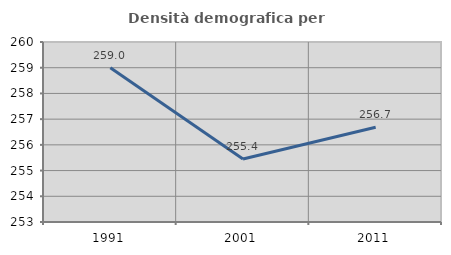
| Category | Densità demografica |
|---|---|
| 1991.0 | 258.997 |
| 2001.0 | 255.449 |
| 2011.0 | 256.683 |